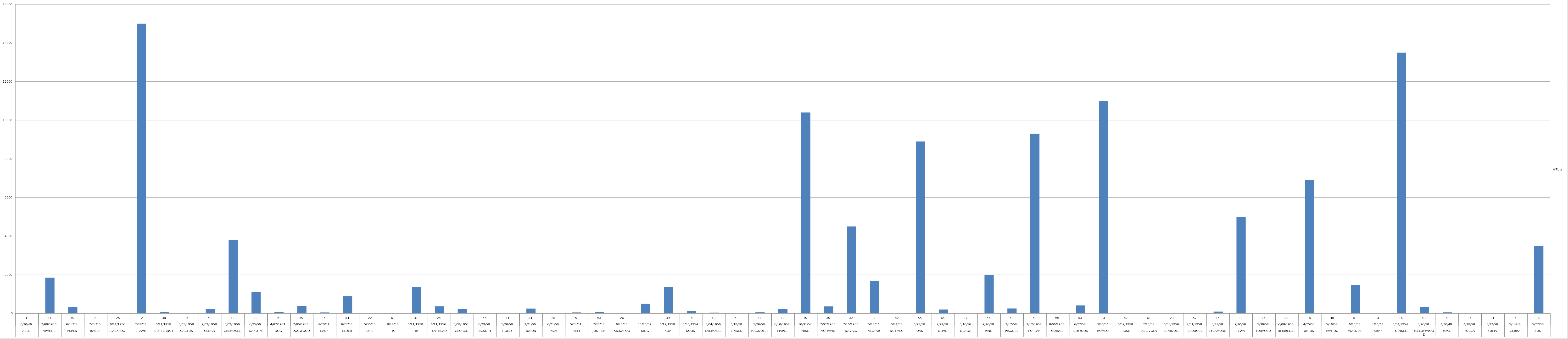
| Category | Total |
|---|---|
| 0 | 21 |
| 1 | 1850 |
| 2 | 319 |
| 3 | 21 |
| 4 | 8 |
| 5 | 15000 |
| 6 | 81 |
| 7 | 18 |
| 8 | 220 |
| 9 | 3800 |
| 10 | 1100 |
| 11 | 81 |
| 12 | 397 |
| 13 | 47 |
| 14 | 880 |
| 15 | 14.9 |
| 16 | 0.02 |
| 17 | 1360 |
| 18 | 365 |
| 19 | 225 |
| 20 | 14 |
| 21 | 5.9 |
| 22 | 250 |
| 23 | 15.2 |
| 24 | 45.5 |
| 25 | 65 |
| 26 | 1.49 |
| 27 | 500 |
| 28 | 1370 |
| 29 | 110 |
| 30 | 40 |
| 31 | 11 |
| 32 | 57 |
| 33 | 213 |
| 34 | 10400 |
| 35 | 360 |
| 36 | 4500 |
| 37 | 1690 |
| 38 | 25.1 |
| 39 | 8900 |
| 40 | 202 |
| 41 | 1.7 |
| 42 | 2000 |
| 43 | 255 |
| 44 | 9300 |
| 45 | 0 |
| 46 | 412 |
| 47 | 11000 |
| 48 | 15 |
| 49 | 0 |
| 50 | 13.7 |
| 51 | 5.2 |
| 52 | 92 |
| 53 | 5000 |
| 54 | 11.6 |
| 55 | 8 |
| 56 | 6900 |
| 57 | 9 |
| 58 | 1450 |
| 59 | 37 |
| 60 | 13500 |
| 61 | 330 |
| 62 | 49 |
| 63 | 1.7 |
| 64 | 0.19 |
| 65 | 18 |
| 66 | 3500 |